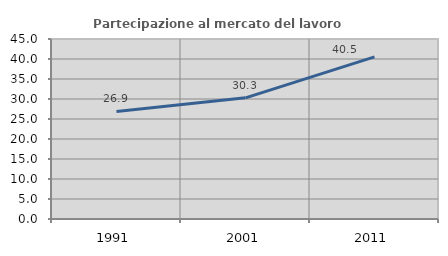
| Category | Partecipazione al mercato del lavoro  femminile |
|---|---|
| 1991.0 | 26.904 |
| 2001.0 | 30.296 |
| 2011.0 | 40.529 |